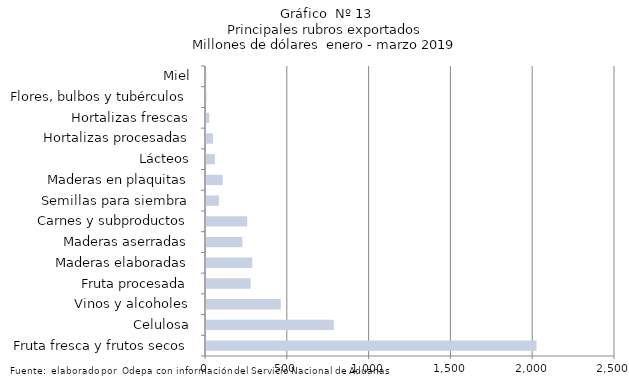
| Category | Series 7 |
|---|---|
| Fruta fresca y frutos secos | 2020384.105 |
| Celulosa | 780664.086 |
| Vinos y alcoholes | 457029.503 |
| Fruta procesada | 273213.456 |
| Maderas elaboradas | 282712.941 |
| Maderas aserradas | 222129.427 |
| Carnes y subproductos | 252198.712 |
| Semillas para siembra | 79107.734 |
| Maderas en plaquitas | 102297.343 |
| Lácteos | 54578.272 |
| Hortalizas procesadas | 42663.485 |
| Hortalizas frescas | 19868.43 |
| Flores, bulbos y tubérculos | 2951.636 |
| Miel | 2413.89 |